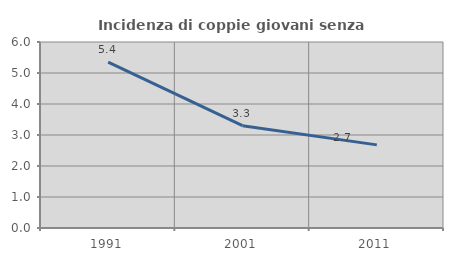
| Category | Incidenza di coppie giovani senza figli |
|---|---|
| 1991.0 | 5.352 |
| 2001.0 | 3.302 |
| 2011.0 | 2.681 |